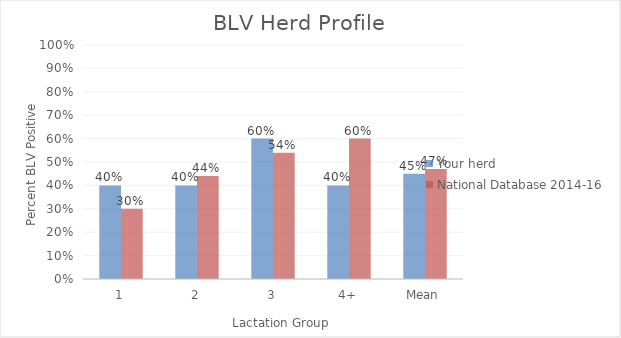
| Category | Your herd | National Database 2014-16 |
|---|---|---|
| 1 | 0.4 | 0.3 |
| 2 | 0.4 | 0.44 |
| 3 | 0.6 | 0.54 |
| 4+ | 0.4 | 0.6 |
| Mean | 0.45 | 0.47 |